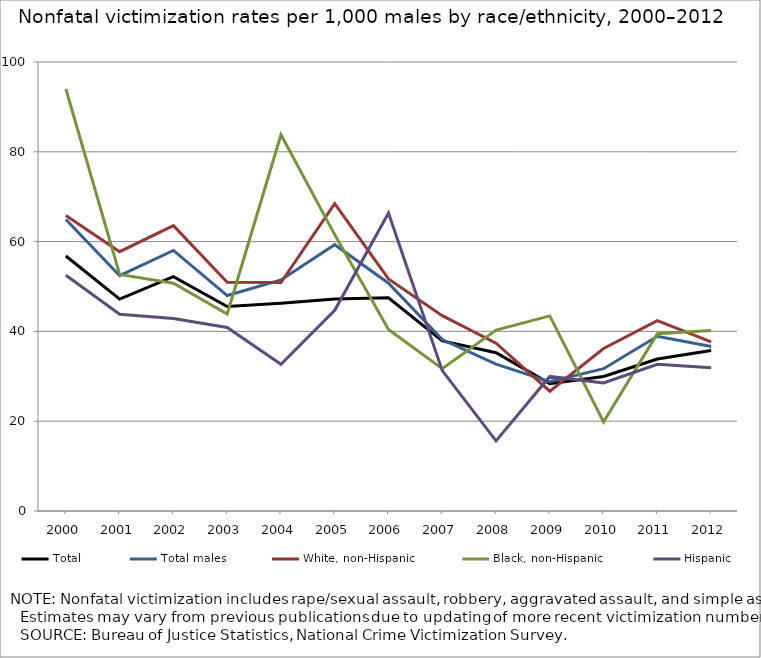
| Category | Total  | Total males | White, non-Hispanic | Black, non-Hispanic  | Hispanic |
|---|---|---|---|---|---|
| 2000.0 | 56.786 | 64.935 | 65.816 | 93.982 | 52.524 |
| 2001.0 | 47.203 | 52.414 | 57.752 | 52.674 | 43.817 |
| 2002.0 | 52.188 | 58.037 | 63.558 | 50.747 | 42.895 |
| 2003.0 | 45.554 | 47.987 | 50.922 | 43.872 | 40.89 |
| 2004.0 | 46.252 | 51.455 | 50.873 | 83.799 | 32.686 |
| 2005.0 | 47.193 | 59.313 | 68.451 | 61.561 | 44.717 |
| 2006.0 | 47.468 | 50.727 | 51.672 | 40.44 | 66.369 |
| 2007.0 | 37.895 | 38.18 | 43.511 | 31.677 | 31.267 |
| 2008.0 | 35.238 | 32.699 | 37.372 | 40.309 | 15.624 |
| 2009.0 | 28.359 | 28.798 | 26.689 | 43.45 | 29.967 |
| 2010.0 | 29.946 | 31.689 | 36.188 | 19.845 | 28.507 |
| 2011.0 | 33.864 | 38.927 | 42.411 | 39.497 | 32.683 |
| 2012.0 | 35.738 | 36.637 | 37.661 | 40.181 | 31.905 |